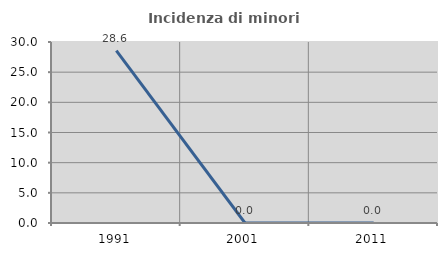
| Category | Incidenza di minori stranieri |
|---|---|
| 1991.0 | 28.571 |
| 2001.0 | 0 |
| 2011.0 | 0 |